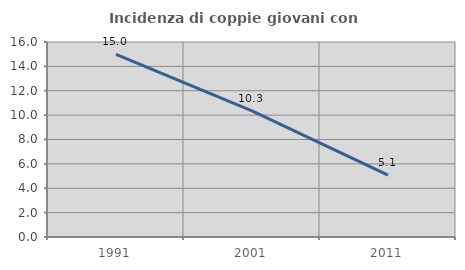
| Category | Incidenza di coppie giovani con figli |
|---|---|
| 1991.0 | 14.989 |
| 2001.0 | 10.345 |
| 2011.0 | 5.08 |